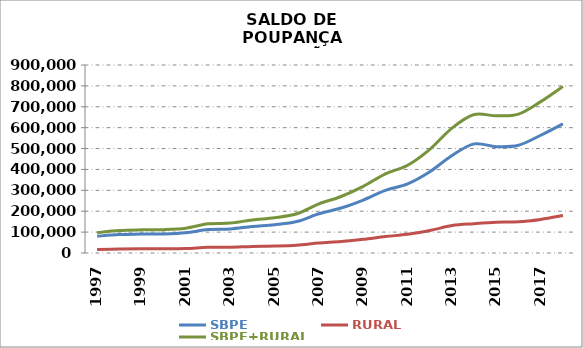
| Category | SBPE | RURAL | SBPE+RURAL |
|---|---|---|---|
| 1997 | 80250.377 | 16813.562 | 97063.939 |
| 1998 | 88538.349 | 18883.24 | 107421.589 |
| 1999 | 90437.74 | 20294.123 | 110731.863 |
| 2000 | 91430.45 | 20310.891 | 111741.341 |
| 2001 | 97146.25 | 21552.598 | 118698.848 |
| 2002 | 112423.444 | 27219.068 | 139642.512 |
| 2003 | 115258.021 | 27799.406 | 143057.427 |
| 2004 | 126853.217 | 31413.354 | 158266.571 |
| 2005 | 135411.681 | 33322.74 | 168734.421 |
| 2006 | 150412.546 | 37523.193 | 187935.739 |
| 2007 | 187827.264 | 47434.388 | 235261.652 |
| 2008 | 215400.282 | 54995.458 | 270395.74 |
| 2009 | 253604.98 | 65477.998 | 319082.978 |
| 2010 | 299878.217 | 78920.574 | 378798.791 |
| 2011 | 330569.272 | 89439.722 | 420008.994 |
| 2012 | 388641.662 | 107660.772 | 496302.434 |
| 2013 | 466788.644 | 131154.416 | 597943.06 |
| 2014 | 522343.501 | 140383.609 | 662727.11 |
| 2015 | 509223.044 | 147366.727 | 656589.771 |
| 2016 | 515955.43 | 149036.994 | 664992.424 |
| 2017 | 563741.675 | 160861.771 | 724603.446 |
| 2018* | 618146.063 | 179134.939 | 797281.002 |